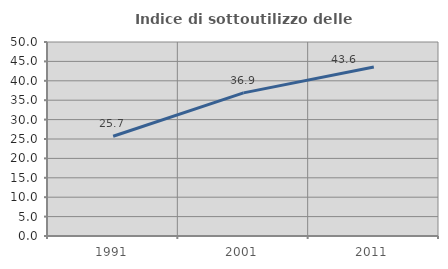
| Category | Indice di sottoutilizzo delle abitazioni  |
|---|---|
| 1991.0 | 25.714 |
| 2001.0 | 36.89 |
| 2011.0 | 43.559 |